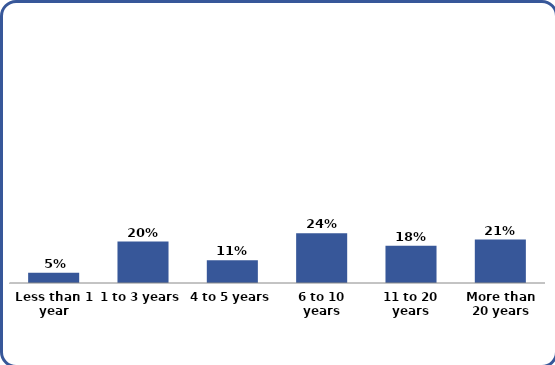
| Category | Series 0 |
|---|---|
| Less than 1 year | 0.05 |
| 1 to 3 years | 0.2 |
| 4 to 5 years | 0.11 |
| 6 to 10 years | 0.24 |
| 11 to 20 years | 0.18 |
| More than 20 years | 0.21 |